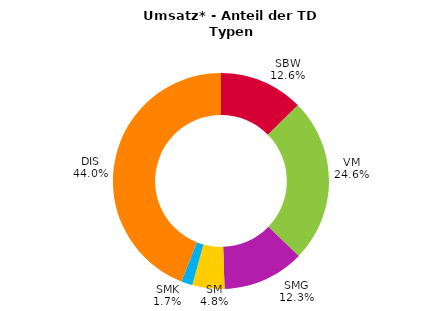
| Category | Series 0 |
|---|---|
| SBW | 0.126 |
| VM | 0.246 |
| SMG | 0.123 |
| SM | 0.048 |
| SMK | 0.017 |
| DIS | 0.44 |